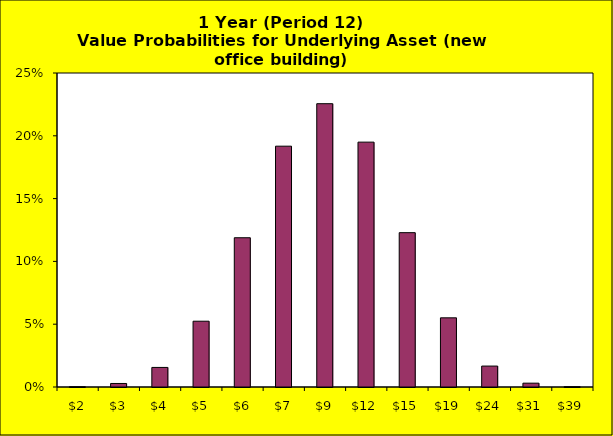
| Category | Series 1 |
|---|---|
| 2.2616033336539743 | 0 |
| 2.865261713887625 | 0.003 |
| 3.630046245026602 | 0.016 |
| 4.598964093633416 | 0.052 |
| 5.82650173217681 | 0.119 |
| 7.381688950791227 | 0.192 |
| 9.351980703157846 | 0.226 |
| 11.848175079615366 | 0.195 |
| 15.01064396655751 | 0.123 |
| 19.017226769243862 | 0.055 |
| 24.093231096452826 | 0.017 |
| 30.524102789050442 | 0.003 |
| 38.67147778338836 | 0 |